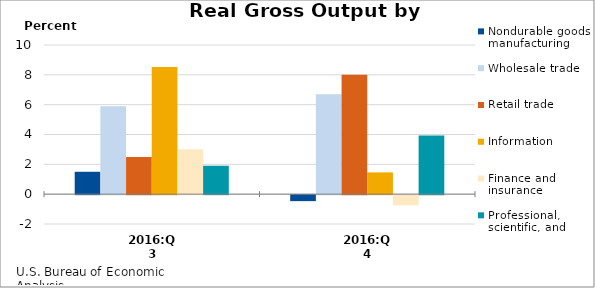
| Category | Nondurable goods manufacturing | Wholesale trade | Retail trade | Information | Finance and insurance | Professional, scientific, and technical services |
|---|---|---|---|---|---|---|
| 2016:Q3 | 1.5 | 5.9 | 2.498 | 8.518 | 3.019 | 1.907 |
| 2016:Q4 | -0.4 | 6.7 | 8 | 1.459 | -0.682 | 3.94 |